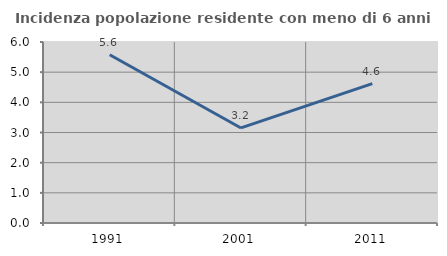
| Category | Incidenza popolazione residente con meno di 6 anni |
|---|---|
| 1991.0 | 5.579 |
| 2001.0 | 3.151 |
| 2011.0 | 4.618 |